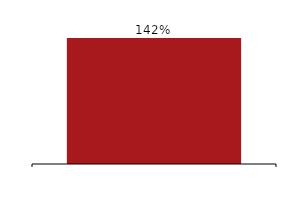
| Category | Liquidity coverage ratio (LCR) - All currencies |
|---|---|
|  | 1.42 |